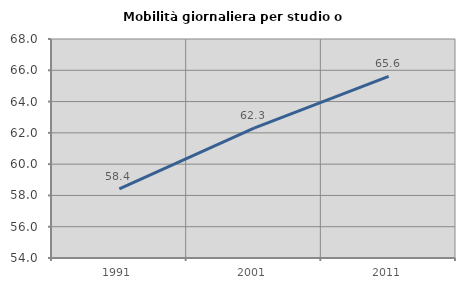
| Category | Mobilità giornaliera per studio o lavoro |
|---|---|
| 1991.0 | 58.423 |
| 2001.0 | 62.3 |
| 2011.0 | 65.605 |